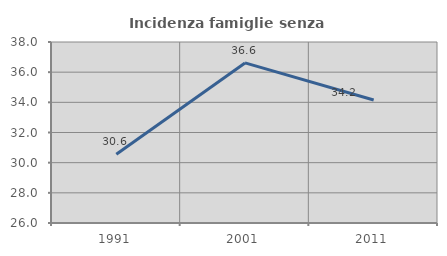
| Category | Incidenza famiglie senza nuclei |
|---|---|
| 1991.0 | 30.556 |
| 2001.0 | 36.614 |
| 2011.0 | 34.156 |